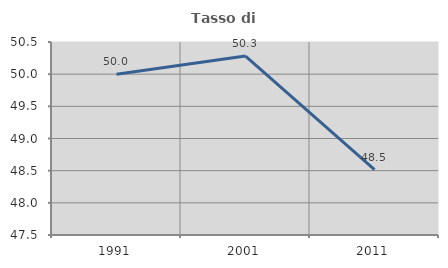
| Category | Tasso di occupazione   |
|---|---|
| 1991.0 | 50 |
| 2001.0 | 50.281 |
| 2011.0 | 48.515 |